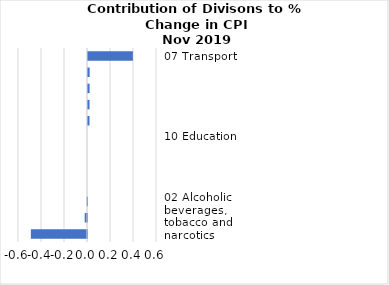
| Category |     Contributions |
|---|---|
| 07 Transport | 0.39 |
| 03 Clothing and footwear | 0.014 |
| 05 Furnishings, household equipment and routine household maintenance | 0.014 |
| 04 Housing, water, electricity, gas and other fuels | 0.013 |
| 09 Recreation and culture | 0.013 |
| 10 Education | 0 |
| 11 Restaurants and hotels | 0 |
| 06 Health | 0 |
| 08 Communication | 0 |
| 12 Miscellaneous goods and services | -0.003 |
| 02 Alcoholic beverages, tobacco and narcotics | -0.02 |
| 01 Food and non-alcoholic beverages | -0.488 |